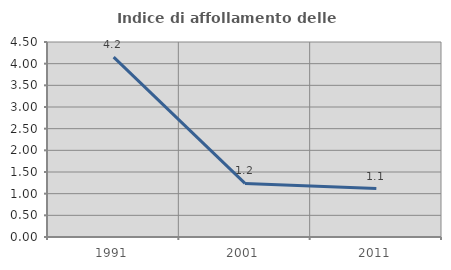
| Category | Indice di affollamento delle abitazioni  |
|---|---|
| 1991.0 | 4.15 |
| 2001.0 | 1.237 |
| 2011.0 | 1.119 |